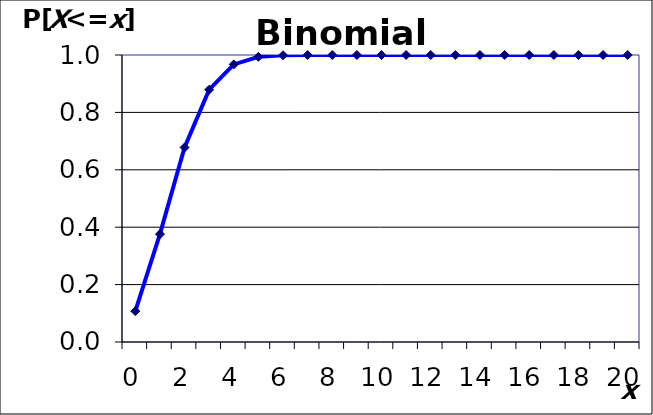
| Category | P[X £ x] |
|---|---|
| 0.0 | 0.107 |
| 1.0 | 0.376 |
| 2.0 | 0.678 |
| 3.0 | 0.879 |
| 4.0 | 0.967 |
| 5.0 | 0.994 |
| 6.0 | 0.999 |
| 7.0 | 1 |
| 8.0 | 1 |
| 9.0 | 1 |
| 10.0 | 1 |
| 11.0 | 1 |
| 12.0 | 1 |
| 13.0 | 1 |
| 14.0 | 1 |
| 15.0 | 1 |
| 16.0 | 1 |
| 17.0 | 1 |
| 18.0 | 1 |
| 19.0 | 1 |
| 20.0 | 1 |